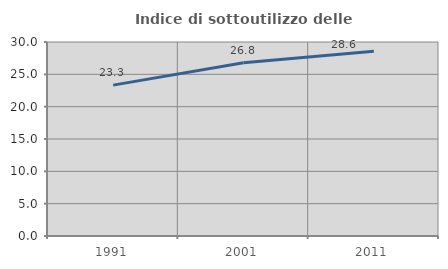
| Category | Indice di sottoutilizzo delle abitazioni  |
|---|---|
| 1991.0 | 23.333 |
| 2001.0 | 26.778 |
| 2011.0 | 28.571 |